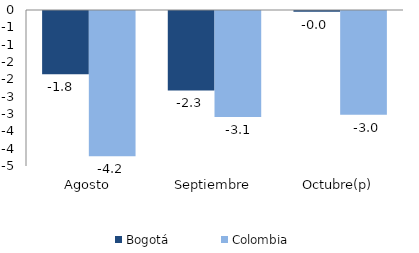
| Category | Bogotá | Colombia |
|---|---|---|
| Agosto | -1.826 | -4.191 |
| Septiembre | -2.292 | -3.06 |
| Octubre(p) | -0.025 | -2.991 |